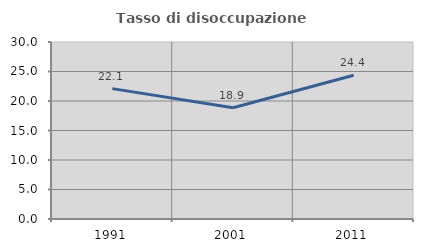
| Category | Tasso di disoccupazione giovanile  |
|---|---|
| 1991.0 | 22.097 |
| 2001.0 | 18.868 |
| 2011.0 | 24.359 |